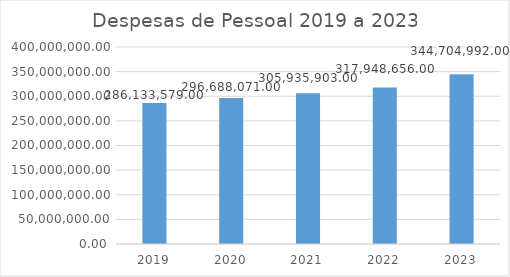
| Category | Despesas de Pessoal 2019 a 2023 |
|---|---|
| 2019.0 | 286133579 |
| 2020.0 | 296688071 |
| 2021.0 | 305935903 |
| 2022.0 | 317948656 |
| 2023.0 | 344704992 |